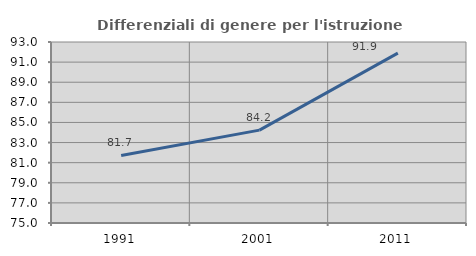
| Category | Differenziali di genere per l'istruzione superiore |
|---|---|
| 1991.0 | 81.718 |
| 2001.0 | 84.236 |
| 2011.0 | 91.891 |